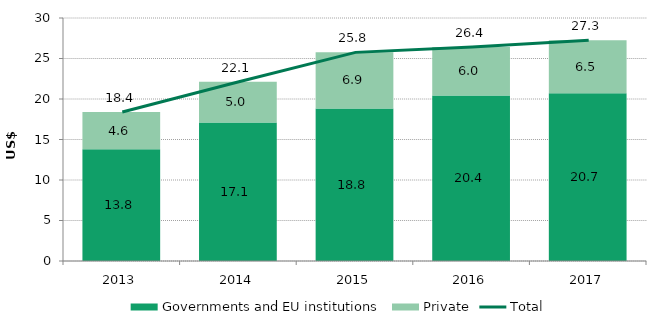
| Category | Governments and EU institutions | Private |
|---|---|---|
| 2013.0 | 13.788 | 4.604 |
| 2014.0 | 17.103 | 5.028 |
| 2015.0 | 18.82 | 6.936 |
| 2016.0 | 20.425 | 5.99 |
| 2017.0 | 20.711 | 6.547 |